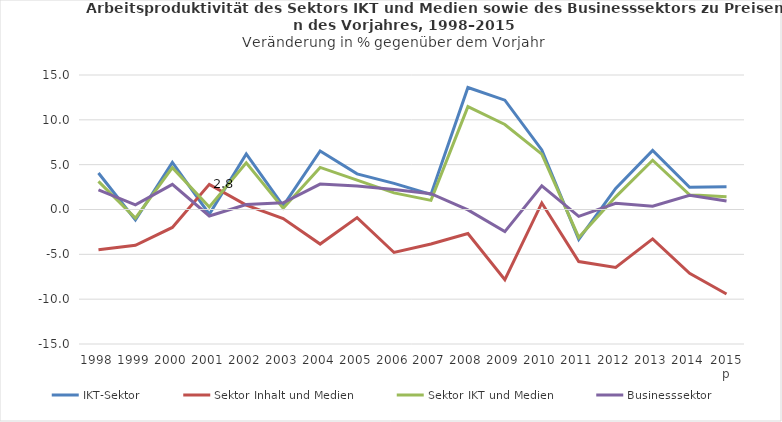
| Category | IKT-Sektor | Sektor Inhalt und Medien | Sektor IKT und Medien | Businesssektor |
|---|---|---|---|---|
| 1998 | 4.07 | -4.485 | 3.135 | 2.197 |
| 1999 | -1.175 | -3.991 | -0.964 | 0.52 |
| 2000 | 5.248 | -2.001 | 4.66 | 2.808 |
| 2001 | -0.523 | 2.808 | 0.28 | -0.72 |
| 2002 | 6.196 | 0.49 | 5.213 | 0.563 |
| 2003 | 0.395 | -1.003 | 0.146 | 0.745 |
| 2004 | 6.521 | -3.856 | 4.698 | 2.836 |
| 2005 | 3.976 | -0.904 | 3.279 | 2.607 |
| 2006 | 2.91 | -4.793 | 1.857 | 2.232 |
| 2007 | 1.675 | -3.84 | 1.016 | 1.758 |
| 2008 | 13.603 | -2.672 | 11.468 | -0.038 |
| 2009 | 12.192 | -7.829 | 9.482 | -2.463 |
| 2010 | 6.641 | 0.728 | 6.173 | 2.643 |
| 2011 | -3.328 | -5.811 | -3.118 | -0.759 |
| 2012 | 2.343 | -6.47 | 1.413 | 0.691 |
| 2013 | 6.592 | -3.273 | 5.49 | 0.37 |
| 2014 | 2.487 | -7.118 | 1.638 | 1.587 |
| 2015 p | 2.524 | -9.418 | 1.411 | 0.948 |